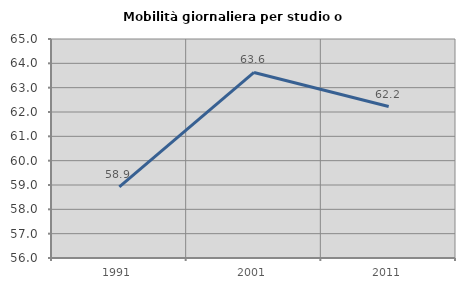
| Category | Mobilità giornaliera per studio o lavoro |
|---|---|
| 1991.0 | 58.926 |
| 2001.0 | 63.625 |
| 2011.0 | 62.223 |